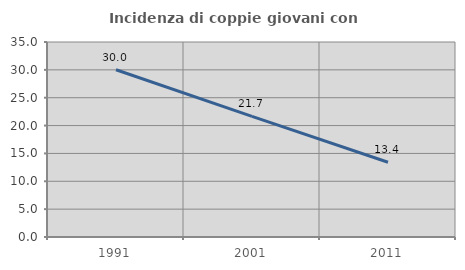
| Category | Incidenza di coppie giovani con figli |
|---|---|
| 1991.0 | 30.021 |
| 2001.0 | 21.652 |
| 2011.0 | 13.412 |